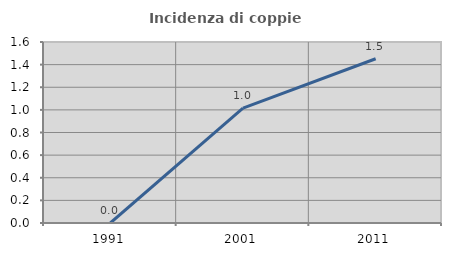
| Category | Incidenza di coppie miste |
|---|---|
| 1991.0 | 0 |
| 2001.0 | 1.015 |
| 2011.0 | 1.452 |